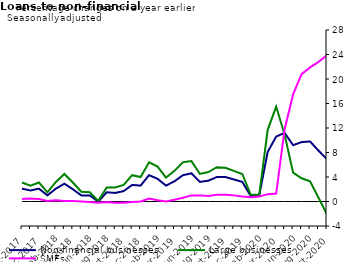
| Category | zero | Non-financial businesses | Large businesses | SMEs |
|---|---|---|---|---|
| Oct-2017 | 0 | 2.1 | 3.1 | 0.4 |
| Nov-2017 | 0 | 1.8 | 2.6 | 0.5 |
| Dec-2017 | 0 | 2.1 | 3.1 | 0.4 |
| Jan-2018 | 0 | 1 | 1.5 | 0.1 |
| Feb-2018 | 0 | 2.1 | 3.2 | 0.2 |
| Mar-2018 | 0 | 2.9 | 4.5 | 0.1 |
| Apr-2018 | 0 | 2 | 3.1 | 0.1 |
| May-2018 | 0 | 1 | 1.6 | 0 |
| Jun-2018 | 0 | 1 | 1.5 | -0.1 |
| Jul-2018 | 0 | 0 | 0.1 | -0.2 |
| Aug-2018 | 0 | 1.5 | 2.3 | -0.1 |
| Sep-2018 | 0 | 1.4 | 2.3 | -0.2 |
| Oct-2018 | 0 | 1.7 | 2.7 | -0.2 |
| Nov-2018 | 0 | 2.7 | 4.3 | -0.1 |
| Dec-2018 | 0 | 2.6 | 4 | 0 |
| Jan-2019 | 0 | 4.3 | 6.4 | 0.5 |
| Feb-2019 | 0 | 3.7 | 5.7 | 0.2 |
| Mar-2019 | 0 | 2.6 | 3.9 | 0 |
| Apr-2019 | 0 | 3.3 | 5 | 0.3 |
| May-2019 | 0 | 4.3 | 6.4 | 0.6 |
| Jun-2019 | 0 | 4.6 | 6.6 | 1 |
| Jul-2019 | 0 | 3.2 | 4.5 | 1 |
| Aug-2019 | 0 | 3.4 | 4.8 | 0.9 |
| Sep-2019 | 0 | 4 | 5.6 | 1.1 |
| Oct-2019 | 0 | 4 | 5.5 | 1.1 |
| Nov-2019 | 0 | 3.6 | 5 | 1 |
| Dec-2019 | 0 | 3.2 | 4.5 | 0.8 |
| Jan-2020 | 0 | 0.9 | 1.1 | 0.7 |
| Feb-2020 | 0 | 1 | 1.1 | 0.8 |
| Mar-2020 | 0 | 8.1 | 11.7 | 1.2 |
| Apr-2020 | 0 | 10.6 | 15.5 | 1.3 |
| May-2020 | 0 | 11.2 | 10.9 | 11.8 |
| Jun-2020 | 0 | 9.2 | 4.7 | 17.5 |
| Jul-2020 | 0 | 9.7 | 3.8 | 20.8 |
| Aug-2020 | 0 | 9.8 | 3.3 | 21.9 |
| Sep-2020 | 0 | 8.3 | 0.6 | 22.8 |
| Oct-2020 | 0 | 6.9 | -2.1 | 23.9 |